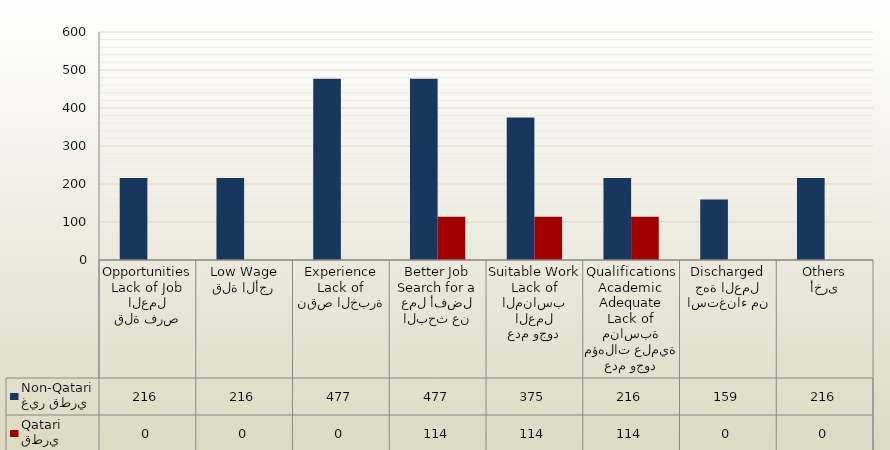
| Category | غير قطري
Non-Qatari | قطري
Qatari |
|---|---|---|
| قلة فرص العمل
Lack of Job Opportunities | 216 | 0 |
| قلة الأجر
Low Wage | 216 | 0 |
| نقص الخبرة
Lack of Experience | 477 | 0 |
| البحث عن عمل أفضل
Search for a Better Job | 477 | 114 |
| عدم وجود العمل المناسب
Lack of Suitable Work | 375 | 114 |
| عدم وجود مؤهلات علمية مناسبة
Lack of Adequate Academic Qualifications | 216 | 114 |
| استغناء من جهة العمل
Discharged | 159 | 0 |
| أخرى
Others | 216 | 0 |